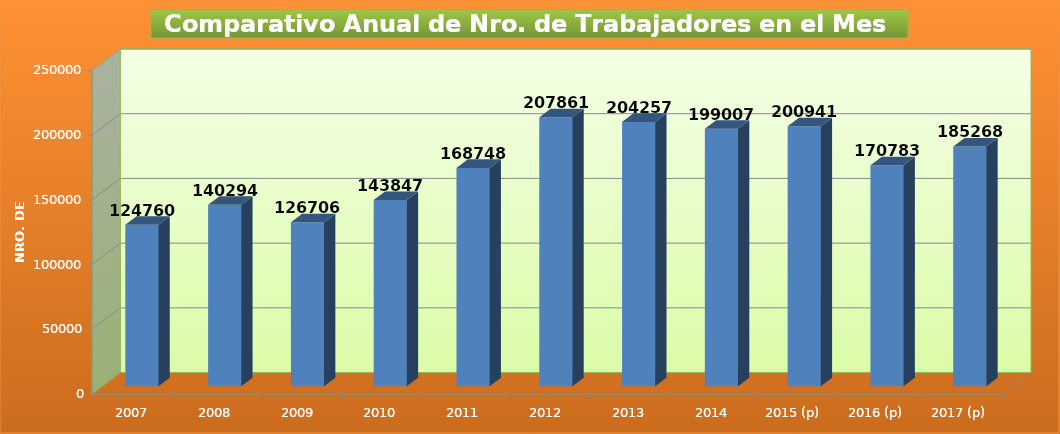
| Category | Series 0 |
|---|---|
| 2007 | 124760 |
| 2008 | 140294 |
| 2009 | 126706 |
| 2010 | 143847 |
| 2011 | 168748 |
| 2012 | 207861 |
| 2013 | 204257 |
| 2014 | 199007 |
| 2015 (p) | 200941 |
| 2016 (p) | 170783 |
| 2017 (p) | 185268 |